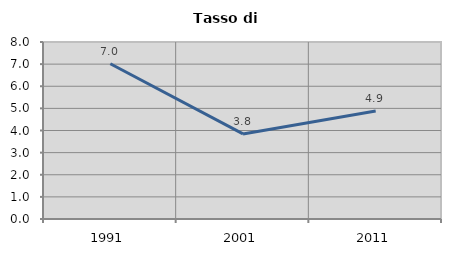
| Category | Tasso di disoccupazione   |
|---|---|
| 1991.0 | 7.018 |
| 2001.0 | 3.846 |
| 2011.0 | 4.878 |